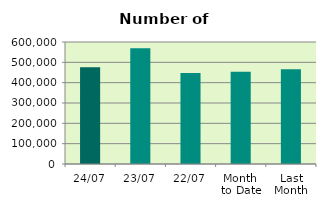
| Category | Series 0 |
|---|---|
| 24/07 | 476354 |
| 23/07 | 569116 |
| 22/07 | 447758 |
| Month 
to Date | 453328.111 |
| Last
Month | 466167.6 |